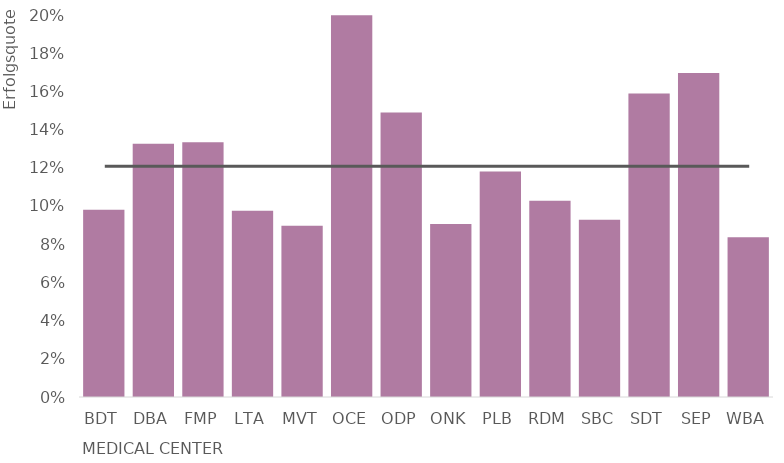
| Category | Erfolgsquote % |
|---|---|
| BDT | 0.098 |
| DBA | 0.133 |
| FMP | 0.133 |
| LTA | 0.098 |
| MVT | 0.09 |
| OCE | 0.2 |
| ODP | 0.149 |
| ONK | 0.091 |
| PLB | 0.118 |
| RDM | 0.103 |
| SBC | 0.093 |
| SDT | 0.159 |
| SEP | 0.17 |
| WBA | 0.084 |